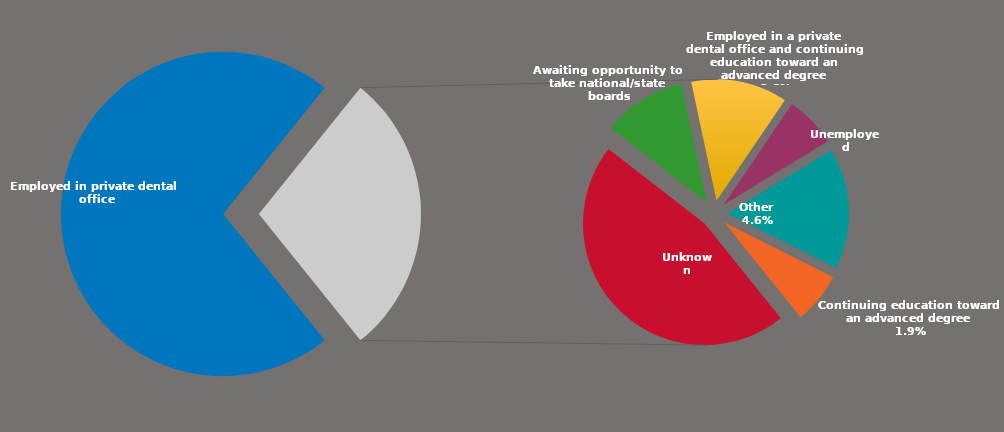
| Category | Series 0 |
|---|---|
| Employed in private dental office | 0.716 |
| Unknown | 0.132 |
| Awaiting opportunity to take national/state boards | 0.032 |
| Employed in a private dental office and continuing education toward an advanced degree | 0.036 |
| Unemployed | 0.019 |
| Other | 0.046 |
| Continuing education toward an advanced degree | 0.019 |